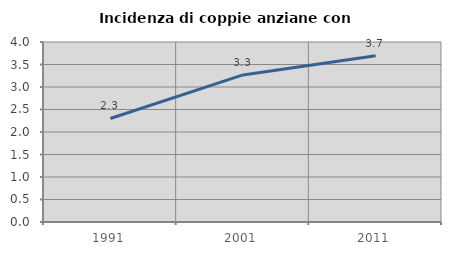
| Category | Incidenza di coppie anziane con figli |
|---|---|
| 1991.0 | 2.301 |
| 2001.0 | 3.269 |
| 2011.0 | 3.693 |